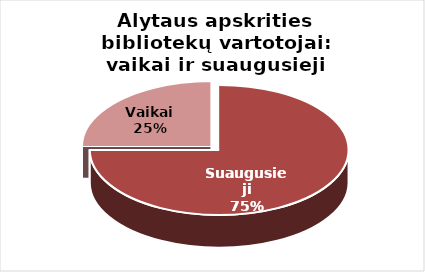
| Category | Series 0 |
|---|---|
| Suaugusieji | 30671 |
| Vaikai | 10220 |